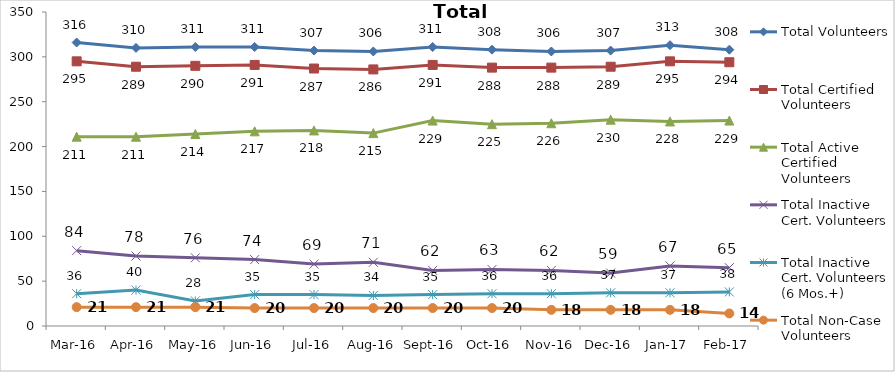
| Category | Total Volunteers | Total Certified Volunteers | Total Active Certified Volunteers | Total Inactive Cert. Volunteers | Total Inactive Cert. Volunteers (6 Mos.+) | Total Non-Case Volunteers |
|---|---|---|---|---|---|---|
| Mar-16 | 316 | 295 | 211 | 84 | 36 | 21 |
| Apr-16 | 310 | 289 | 211 | 78 | 40 | 21 |
| May-16 | 311 | 290 | 214 | 76 | 28 | 21 |
| Jun-16 | 311 | 291 | 217 | 74 | 35 | 20 |
| Jul-16 | 307 | 287 | 218 | 69 | 35 | 20 |
| Aug-16 | 306 | 286 | 215 | 71 | 34 | 20 |
| Sep-16 | 311 | 291 | 229 | 62 | 35 | 20 |
| Oct-16 | 308 | 288 | 225 | 63 | 36 | 20 |
| Nov-16 | 306 | 288 | 226 | 62 | 36 | 18 |
| Dec-16 | 307 | 289 | 230 | 59 | 37 | 18 |
| Jan-17 | 313 | 295 | 228 | 67 | 37 | 18 |
| Feb-17 | 308 | 294 | 229 | 65 | 38 | 14 |